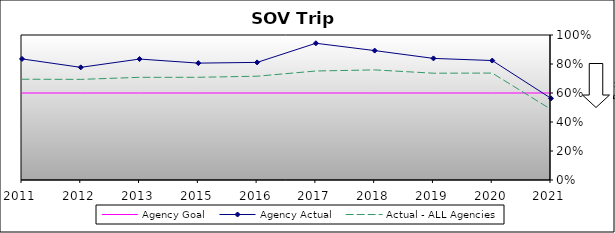
| Category | Agency Goal | Agency Actual | Actual - ALL Agencies |
|---|---|---|---|
| 2011.0 | 0.6 | 0.835 | 0.695 |
| 2012.0 | 0.6 | 0.777 | 0.694 |
| 2013.0 | 0.6 | 0.834 | 0.708 |
| 2015.0 | 0.6 | 0.806 | 0.708 |
| 2016.0 | 0.6 | 0.811 | 0.716 |
| 2017.0 | 0.6 | 0.943 | 0.752 |
| 2018.0 | 0.6 | 0.892 | 0.759 |
| 2019.0 | 0.6 | 0.839 | 0.736 |
| 2020.0 | 0.6 | 0.824 | 0.737 |
| 2021.0 | 0.6 | 0.563 | 0.487 |